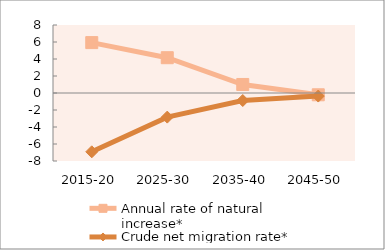
| Category | Annual rate of natural increase* | Crude net migration rate* |
|---|---|---|
| 2015-20 | 5.93 | -6.92 |
| 2025-30 | 4.152 | -2.838 |
| 2035-40 | 1.002 | -0.883 |
| 2045-50 | -0.21 | -0.36 |